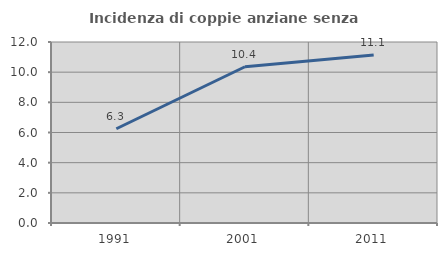
| Category | Incidenza di coppie anziane senza figli  |
|---|---|
| 1991.0 | 6.25 |
| 2001.0 | 10.359 |
| 2011.0 | 11.133 |